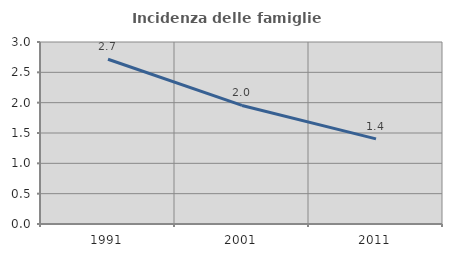
| Category | Incidenza delle famiglie numerose |
|---|---|
| 1991.0 | 2.716 |
| 2001.0 | 1.955 |
| 2011.0 | 1.403 |